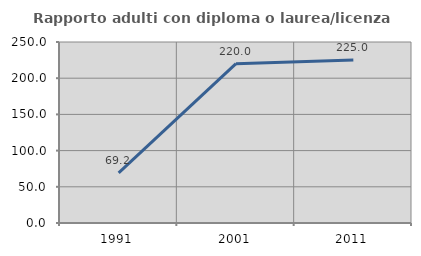
| Category | Rapporto adulti con diploma o laurea/licenza media  |
|---|---|
| 1991.0 | 69.231 |
| 2001.0 | 220 |
| 2011.0 | 225 |